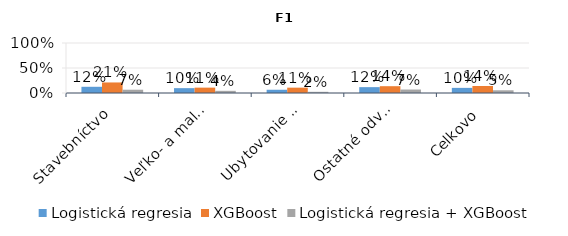
| Category | Logistická regresia | XGBoost | Logistická regresia + XGBoost |
|---|---|---|---|
| Stavebníctvo | 0.124 | 0.211 | 0.066 |
| Veľko- a maloobchod | 0.097 | 0.107 | 0.043 |
| Ubytovanie a stravovanie | 0.065 | 0.107 | 0.024 |
| Ostatné odvetvia | 0.117 | 0.136 | 0.069 |
| Celkovo | 0.102 | 0.14 | 0.054 |